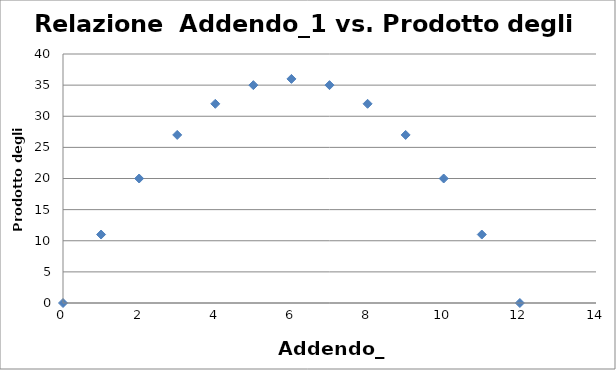
| Category | Series 0 |
|---|---|
| 0.0 | 0 |
| 1.0 | 11 |
| 2.0 | 20 |
| 3.0 | 27 |
| 4.0 | 32 |
| 5.0 | 35 |
| 6.0 | 36 |
| 7.0 | 35 |
| 8.0 | 32 |
| 9.0 | 27 |
| 10.0 | 20 |
| 11.0 | 11 |
| 12.0 | 0 |